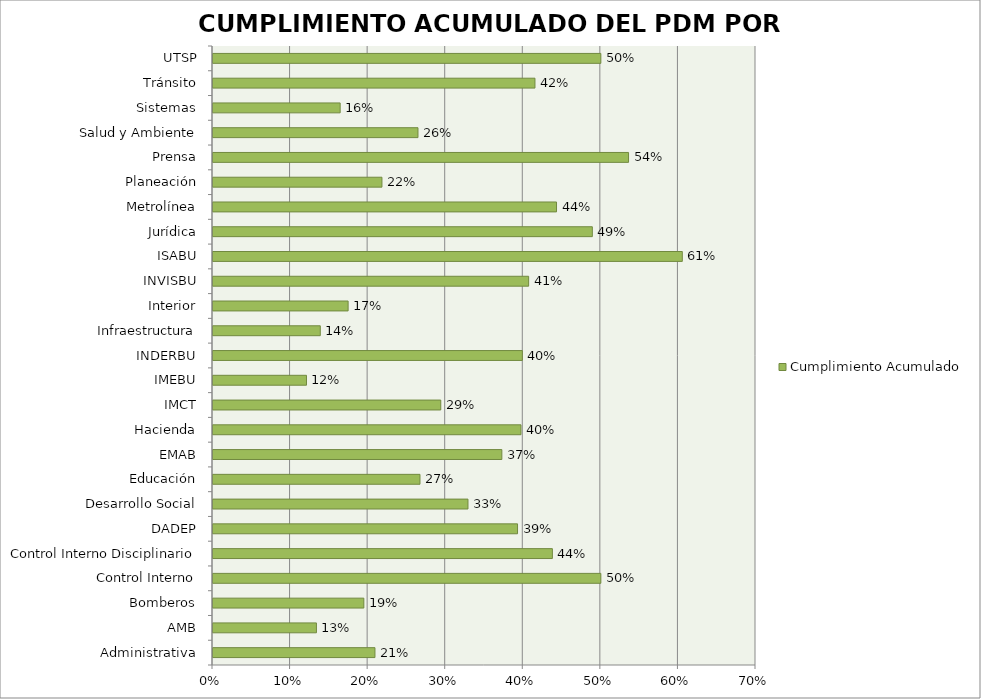
| Category | Cumplimiento Acumulado |
|---|---|
| Administrativa | 0.209 |
| AMB | 0.133 |
| Bomberos | 0.194 |
| Control Interno | 0.5 |
| Control Interno Disciplinario | 0.438 |
| DADEP | 0.393 |
| Desarrollo Social | 0.329 |
| Educación | 0.267 |
| EMAB | 0.372 |
| Hacienda | 0.397 |
| IMCT | 0.294 |
| IMEBU | 0.121 |
| INDERBU | 0.399 |
| Infraestructura | 0.138 |
| Interior | 0.174 |
| INVISBU | 0.407 |
| ISABU | 0.605 |
| Jurídica | 0.489 |
| Metrolínea | 0.443 |
| Planeación | 0.218 |
| Prensa | 0.536 |
| Salud y Ambiente | 0.264 |
| Sistemas | 0.164 |
| Tránsito | 0.415 |
| UTSP | 0.5 |